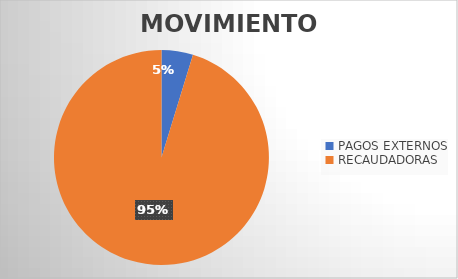
| Category | MOVIMIENTOS |
|---|---|
| PAGOS EXTERNOS | 1096 |
| RECAUDADORAS | 22067 |